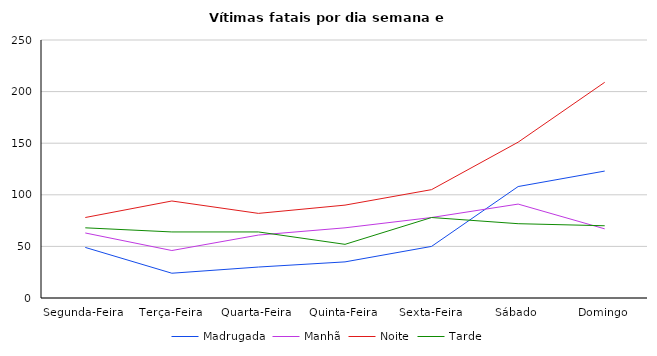
| Category | Madrugada | Manhã | Noite | Tarde |
|---|---|---|---|---|
| Segunda-Feira | 49 | 63 | 78 | 68 |
| Terça-Feira | 24 | 46 | 94 | 64 |
| Quarta-Feira | 30 | 61 | 82 | 64 |
| Quinta-Feira | 35 | 68 | 90 | 52 |
| Sexta-Feira | 50 | 78 | 105 | 78 |
| Sábado | 108 | 91 | 151 | 72 |
| Domingo | 123 | 67 | 209 | 70 |